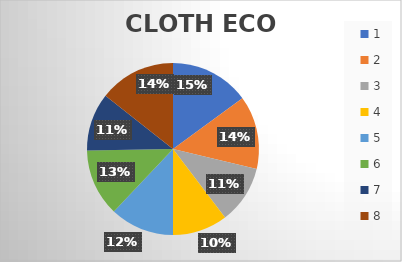
| Category | CLOTH ECO BANG |
|---|---|
| 0 | 26 |
| 1 | 24 |
| 2 | 19 |
| 3 | 18 |
| 4 | 21 |
| 5 | 22 |
| 6 | 19 |
| 7 | 25 |